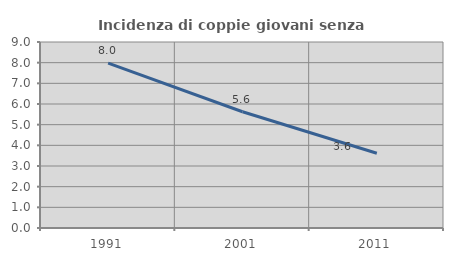
| Category | Incidenza di coppie giovani senza figli |
|---|---|
| 1991.0 | 7.975 |
| 2001.0 | 5.625 |
| 2011.0 | 3.614 |